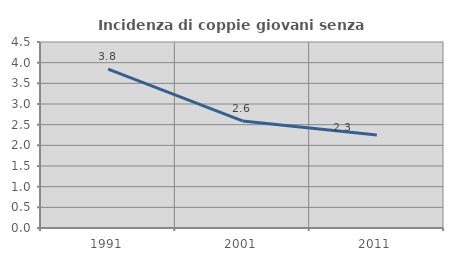
| Category | Incidenza di coppie giovani senza figli |
|---|---|
| 1991.0 | 3.846 |
| 2001.0 | 2.591 |
| 2011.0 | 2.252 |